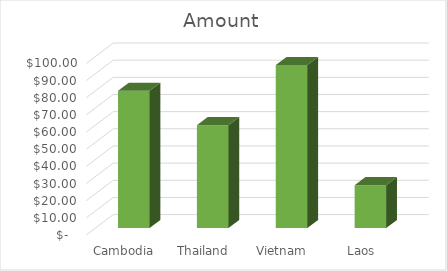
| Category | Amount |
|---|---|
| Cambodia | 80 |
| Thailand | 60 |
| Vietnam | 95 |
| Laos | 25 |